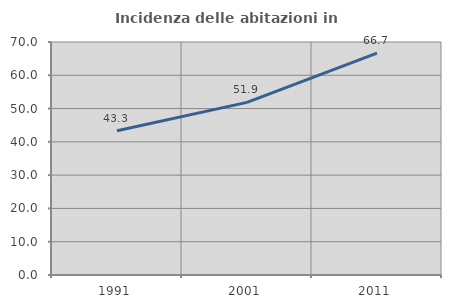
| Category | Incidenza delle abitazioni in proprietà  |
|---|---|
| 1991.0 | 43.333 |
| 2001.0 | 51.852 |
| 2011.0 | 66.667 |